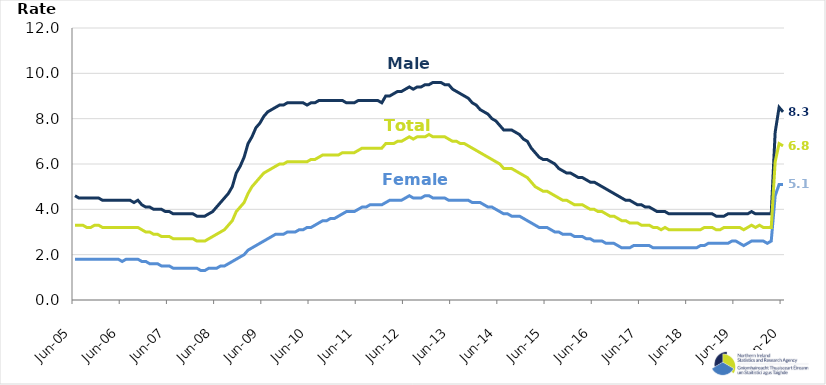
| Category | Male | Female | Total |
|---|---|---|---|
| 2005-06-01 | 4.6 | 1.8 | 3.3 |
| 2005-07-01 | 4.5 | 1.8 | 3.3 |
| 2005-08-01 | 4.5 | 1.8 | 3.3 |
| 2005-09-01 | 4.5 | 1.8 | 3.2 |
| 2005-10-01 | 4.5 | 1.8 | 3.2 |
| 2005-11-01 | 4.5 | 1.8 | 3.3 |
| 2005-12-01 | 4.5 | 1.8 | 3.3 |
| 2006-01-01 | 4.4 | 1.8 | 3.2 |
| 2006-02-01 | 4.4 | 1.8 | 3.2 |
| 2006-03-01 | 4.4 | 1.8 | 3.2 |
| 2006-04-01 | 4.4 | 1.8 | 3.2 |
| 2006-05-01 | 4.4 | 1.8 | 3.2 |
| 2006-06-01 | 4.4 | 1.7 | 3.2 |
| 2006-07-01 | 4.4 | 1.8 | 3.2 |
| 2006-08-01 | 4.4 | 1.8 | 3.2 |
| 2006-09-01 | 4.3 | 1.8 | 3.2 |
| 2006-10-01 | 4.4 | 1.8 | 3.2 |
| 2006-11-01 | 4.2 | 1.7 | 3.1 |
| 2006-12-01 | 4.1 | 1.7 | 3 |
| 2007-01-01 | 4.1 | 1.6 | 3 |
| 2007-02-01 | 4 | 1.6 | 2.9 |
| 2007-03-01 | 4 | 1.6 | 2.9 |
| 2007-04-01 | 4 | 1.5 | 2.8 |
| 2007-05-01 | 3.9 | 1.5 | 2.8 |
| 2007-06-01 | 3.9 | 1.5 | 2.8 |
| 2007-07-01 | 3.8 | 1.4 | 2.7 |
| 2007-08-01 | 3.8 | 1.4 | 2.7 |
| 2007-09-01 | 3.8 | 1.4 | 2.7 |
| 2007-10-01 | 3.8 | 1.4 | 2.7 |
| 2007-11-01 | 3.8 | 1.4 | 2.7 |
| 2007-12-01 | 3.8 | 1.4 | 2.7 |
| 2008-01-01 | 3.7 | 1.4 | 2.6 |
| 2008-02-01 | 3.7 | 1.3 | 2.6 |
| 2008-03-01 | 3.7 | 1.3 | 2.6 |
| 2008-04-01 | 3.8 | 1.4 | 2.7 |
| 2008-05-01 | 3.9 | 1.4 | 2.8 |
| 2008-06-01 | 4.1 | 1.4 | 2.9 |
| 2008-07-01 | 4.3 | 1.5 | 3 |
| 2008-08-01 | 4.5 | 1.5 | 3.1 |
| 2008-09-01 | 4.7 | 1.6 | 3.3 |
| 2008-10-01 | 5 | 1.7 | 3.5 |
| 2008-11-01 | 5.6 | 1.8 | 3.9 |
| 2008-12-01 | 5.9 | 1.9 | 4.1 |
| 2009-01-01 | 6.3 | 2 | 4.3 |
| 2009-02-01 | 6.9 | 2.2 | 4.7 |
| 2009-03-01 | 7.2 | 2.3 | 5 |
| 2009-04-01 | 7.6 | 2.4 | 5.2 |
| 2009-05-01 | 7.8 | 2.5 | 5.4 |
| 2009-06-01 | 8.1 | 2.6 | 5.6 |
| 2009-07-01 | 8.3 | 2.7 | 5.7 |
| 2009-08-01 | 8.4 | 2.8 | 5.8 |
| 2009-09-01 | 8.5 | 2.9 | 5.9 |
| 2009-10-01 | 8.6 | 2.9 | 6 |
| 2009-11-01 | 8.6 | 2.9 | 6 |
| 2009-12-01 | 8.7 | 3 | 6.1 |
| 2010-01-01 | 8.7 | 3 | 6.1 |
| 2010-02-01 | 8.7 | 3 | 6.1 |
| 2010-03-01 | 8.7 | 3.1 | 6.1 |
| 2010-04-01 | 8.7 | 3.1 | 6.1 |
| 2010-05-01 | 8.6 | 3.2 | 6.1 |
| 2010-06-01 | 8.7 | 3.2 | 6.2 |
| 2010-07-01 | 8.7 | 3.3 | 6.2 |
| 2010-08-01 | 8.8 | 3.4 | 6.3 |
| 2010-09-01 | 8.8 | 3.5 | 6.4 |
| 2010-10-01 | 8.8 | 3.5 | 6.4 |
| 2010-11-01 | 8.8 | 3.6 | 6.4 |
| 2010-12-01 | 8.8 | 3.6 | 6.4 |
| 2011-01-01 | 8.8 | 3.7 | 6.4 |
| 2011-02-01 | 8.8 | 3.8 | 6.5 |
| 2011-03-01 | 8.7 | 3.9 | 6.5 |
| 2011-04-01 | 8.7 | 3.9 | 6.5 |
| 2011-05-01 | 8.7 | 3.9 | 6.5 |
| 2011-06-01 | 8.8 | 4 | 6.6 |
| 2011-07-01 | 8.8 | 4.1 | 6.7 |
| 2011-08-01 | 8.8 | 4.1 | 6.7 |
| 2011-09-01 | 8.8 | 4.2 | 6.7 |
| 2011-10-01 | 8.8 | 4.2 | 6.7 |
| 2011-11-01 | 8.8 | 4.2 | 6.7 |
| 2011-12-01 | 8.7 | 4.2 | 6.7 |
| 2012-01-01 | 9 | 4.3 | 6.9 |
| 2012-02-01 | 9 | 4.4 | 6.9 |
| 2012-03-01 | 9.1 | 4.4 | 6.9 |
| 2012-04-01 | 9.2 | 4.4 | 7 |
| 2012-05-01 | 9.2 | 4.4 | 7 |
| 2012-06-01 | 9.3 | 4.5 | 7.1 |
| 2012-07-01 | 9.4 | 4.6 | 7.2 |
| 2012-08-01 | 9.3 | 4.5 | 7.1 |
| 2012-09-01 | 9.4 | 4.5 | 7.2 |
| 2012-10-01 | 9.4 | 4.5 | 7.2 |
| 2012-11-01 | 9.5 | 4.6 | 7.2 |
| 2012-12-01 | 9.5 | 4.6 | 7.3 |
| 2013-01-01 | 9.6 | 4.5 | 7.2 |
| 2013-02-01 | 9.6 | 4.5 | 7.2 |
| 2013-03-01 | 9.6 | 4.5 | 7.2 |
| 2013-04-01 | 9.5 | 4.5 | 7.2 |
| 2013-05-01 | 9.5 | 4.4 | 7.1 |
| 2013-06-01 | 9.3 | 4.4 | 7 |
| 2013-07-01 | 9.2 | 4.4 | 7 |
| 2013-08-01 | 9.1 | 4.4 | 6.9 |
| 2013-09-01 | 9 | 4.4 | 6.9 |
| 2013-10-01 | 8.9 | 4.4 | 6.8 |
| 2013-11-01 | 8.7 | 4.3 | 6.7 |
| 2013-12-01 | 8.6 | 4.3 | 6.6 |
| 2014-01-01 | 8.4 | 4.3 | 6.5 |
| 2014-02-01 | 8.3 | 4.2 | 6.4 |
| 2014-03-01 | 8.2 | 4.1 | 6.3 |
| 2014-04-01 | 8 | 4.1 | 6.2 |
| 2014-05-01 | 7.9 | 4 | 6.1 |
| 2014-06-01 | 7.7 | 3.9 | 6 |
| 2014-07-01 | 7.5 | 3.8 | 5.8 |
| 2014-08-01 | 7.5 | 3.8 | 5.8 |
| 2014-09-01 | 7.5 | 3.7 | 5.8 |
| 2014-10-01 | 7.4 | 3.7 | 5.7 |
| 2014-11-01 | 7.3 | 3.7 | 5.6 |
| 2014-12-01 | 7.1 | 3.6 | 5.5 |
| 2015-01-01 | 7 | 3.5 | 5.4 |
| 2015-02-01 | 6.7 | 3.4 | 5.2 |
| 2015-03-01 | 6.5 | 3.3 | 5 |
| 2015-04-01 | 6.3 | 3.2 | 4.9 |
| 2015-05-01 | 6.2 | 3.2 | 4.8 |
| 2015-06-01 | 6.2 | 3.2 | 4.8 |
| 2015-07-01 | 6.1 | 3.1 | 4.7 |
| 2015-08-01 | 6 | 3 | 4.6 |
| 2015-09-01 | 5.8 | 3 | 4.5 |
| 2015-10-01 | 5.7 | 2.9 | 4.4 |
| 2015-11-01 | 5.6 | 2.9 | 4.4 |
| 2015-12-01 | 5.6 | 2.9 | 4.3 |
| 2016-01-01 | 5.5 | 2.8 | 4.2 |
| 2016-02-01 | 5.4 | 2.8 | 4.2 |
| 2016-03-01 | 5.4 | 2.8 | 4.2 |
| 2016-04-01 | 5.3 | 2.7 | 4.1 |
| 2016-05-01 | 5.2 | 2.7 | 4 |
| 2016-06-01 | 5.2 | 2.6 | 4 |
| 2016-07-01 | 5.1 | 2.6 | 3.9 |
| 2016-08-01 | 5 | 2.6 | 3.9 |
| 2016-09-01 | 4.9 | 2.5 | 3.8 |
| 2016-10-01 | 4.8 | 2.5 | 3.7 |
| 2016-11-01 | 4.7 | 2.5 | 3.7 |
| 2016-12-01 | 4.6 | 2.4 | 3.6 |
| 2017-01-01 | 4.5 | 2.3 | 3.5 |
| 2017-02-01 | 4.4 | 2.3 | 3.5 |
| 2017-03-01 | 4.4 | 2.3 | 3.4 |
| 2017-04-01 | 4.3 | 2.4 | 3.4 |
| 2017-05-01 | 4.2 | 2.4 | 3.4 |
| 2017-06-01 | 4.2 | 2.4 | 3.3 |
| 2017-07-01 | 4.1 | 2.4 | 3.3 |
| 2017-08-01 | 4.1 | 2.4 | 3.3 |
| 2017-09-01 | 4 | 2.3 | 3.2 |
| 2017-10-01 | 3.9 | 2.3 | 3.2 |
| 2017-11-01 | 3.9 | 2.3 | 3.1 |
| 2017-12-01 | 3.9 | 2.3 | 3.2 |
| 2018-01-01 | 3.8 | 2.3 | 3.1 |
| 2018-02-01 | 3.8 | 2.3 | 3.1 |
| 2018-03-01 | 3.8 | 2.3 | 3.1 |
| 2018-04-01 | 3.8 | 2.3 | 3.1 |
| 2018-05-01 | 3.8 | 2.3 | 3.1 |
| 2018-06-01 | 3.8 | 2.3 | 3.1 |
| 2018-07-01 | 3.8 | 2.3 | 3.1 |
| 2018-08-01 | 3.8 | 2.3 | 3.1 |
| 2018-09-01 | 3.8 | 2.4 | 3.1 |
| 2018-10-01 | 3.8 | 2.4 | 3.2 |
| 2018-11-01 | 3.8 | 2.5 | 3.2 |
| 2018-12-01 | 3.8 | 2.5 | 3.2 |
| 2019-01-01 | 3.7 | 2.5 | 3.1 |
| 2019-02-01 | 3.7 | 2.5 | 3.1 |
| 2019-03-01 | 3.7 | 2.5 | 3.2 |
| 2019-04-01 | 3.8 | 2.5 | 3.2 |
| 2019-05-01 | 3.8 | 2.6 | 3.2 |
| 2019-06-01 | 3.8 | 2.6 | 3.2 |
| 2019-07-01 | 3.8 | 2.5 | 3.2 |
| 2019-08-01 | 3.8 | 2.4 | 3.1 |
| 2019-09-01 | 3.8 | 2.5 | 3.2 |
| 2019-10-01 | 3.9 | 2.6 | 3.3 |
| 2019-11-01 | 3.8 | 2.6 | 3.2 |
| 2019-12-01 | 3.8 | 2.6 | 3.3 |
| 2020-01-01 | 3.8 | 2.6 | 3.2 |
| 2020-02-01 | 3.8 | 2.5 | 3.2 |
| 2020-03-01 | 3.8 | 2.6 | 3.2 |
| 2020-04-01 | 7.4 | 4.6 | 6.1 |
| 2020-05-01 | 8.5 | 5.1 | 6.9 |
| 2020-06-01 | 8.3 | 5.1 | 6.8 |